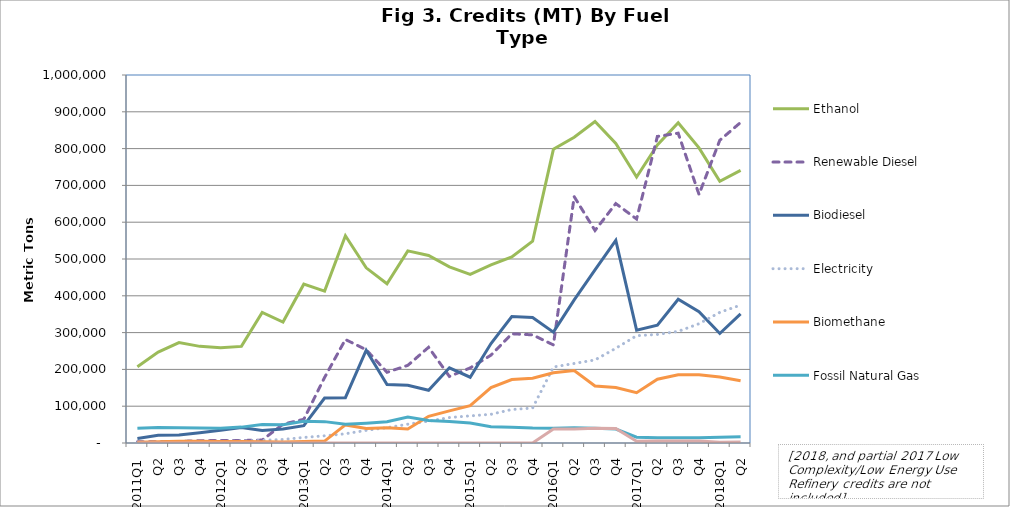
| Category | Ethanol | Renewable Diesel  | Biodiesel | Electricity | Biomethane | Fossil Natural Gas | Other (Hydrogen, Innovative Crude & Low Complexity / Low Energy Use Refining, etc.) |
|---|---|---|---|---|---|---|---|
| 2011Q1 | 207001 | 3070 | 12300 | 459 | 2212 | 39934 | 0 |
| Q2 | 246919 | 3368 | 21284 | 1293 | 3069 | 42169 | 0 |
| Q3 | 273030 | 4362 | 22065 | 2455 | 4960 | 41443 | 0 |
| Q4 | 262607 | 6220 | 27712 | 3536 | 4474 | 40844 | 0 |
| 2012Q1 | 258548 | 6701 | 34458 | 4519 | 4367 | 40226 | 0 |
| Q2 | 262546 | 6804 | 41895 | 5560 | 4221 | 43158 | 0 |
| Q3 | 354773 | 7938 | 34051 | 7294 | 3577 | 49942 | 0 |
| Q4 | 328563 | 51216 | 37898 | 9611 | 2680 | 49844 | 0 |
| 2013Q1 | 431644 | 64397 | 46947 | 15051 | 4240 | 59246 | 0 |
| Q2 | 412859 | 178165 | 122102 | 19516 | 5180 | 58052 | 0 |
| Q3 | 563157 | 281298 | 123186 | 25039 | 49115 | 50834 | 0 |
| Q4 | 476004 | 253450 | 252312 | 34347 | 39534 | 53816 | 0 |
| 2014Q1 | 432588 | 192175 | 158845 | 41753 | 41704 | 57704 | 0 |
| Q2 | 522129 | 211004 | 156874 | 51092 | 37832 | 70435 | 0 |
| Q3 | 509671 | 260123 | 143376 | 59366 | 72480 | 60886 | 0 |
| Q4 | 478509 | 180884 | 204252 | 69119 | 87230 | 58340 | 0 |
| 2015Q1 | 458351 | 204054 | 178702 | 73708 | 101324 | 54423 | 0 |
| Q2 | 484000 | 238751 | 270167 | 78072 | 150581 | 43984 | 0 |
| Q3 | 505725 | 296768 | 343733 | 91036 | 172350 | 42638 | 50 |
| Q4 | 548303 | 293906 | 341156 | 94924 | 175955 | 40464 | 24 |
| 2016Q1 | 798073 | 266508 | 301352 | 206464 | 190635 | 39883 | 37975 |
| Q2 | 831009 | 669370 | 388860 | 216149 | 196874 | 41523 | 38243 |
| Q3 | 873603 | 577493 | 470248 | 225640 | 154994 | 39990 | 39843 |
| Q4 | 814114 | 650579 | 550529 | 257321 | 150891 | 37780 | 39493 |
| 2017Q1 | 722841 | 608609 | 306632 | 291645 | 136639 | 15855 | 4520 |
| Q2 | 809859 | 833060 | 320403 | 295010 | 173392 | 14212 | 5109 |
| Q3 | 870161 | 841941 | 390633 | 303385 | 185162 | 14206 | 5209 |
| Q4 | 802005 | 675433 | 356769 | 324060 | 185603 | 14423 | 5135 |
| 2018Q1 | 711328 | 822711 | 297647 | 354930 | 179359 | 15608 | 2008 |
| Q2 | 740923 | 871049 | 351082 | 374667 | 168945 | 16775 | 2527 |